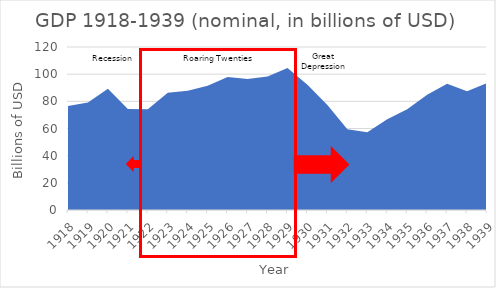
| Category | Series 0 |
|---|---|
| 1918.0 | 76.567 |
| 1919.0 | 79.09 |
| 1920.0 | 89.246 |
| 1921.0 | 74.314 |
| 1922.0 | 74.14 |
| 1923.0 | 86.238 |
| 1924.0 | 87.786 |
| 1925.0 | 91.449 |
| 1926.0 | 97.885 |
| 1927.0 | 96.466 |
| 1928.0 | 98.305 |
| 1929.0 | 104.556 |
| 1930.0 | 92.16 |
| 1931.0 | 77.391 |
| 1932.0 | 59.522 |
| 1933.0 | 57.154 |
| 1934.0 | 66.8 |
| 1935.0 | 74.241 |
| 1936.0 | 84.83 |
| 1937.0 | 93.003 |
| 1938.0 | 87.352 |
| 1939.0 | 93.437 |